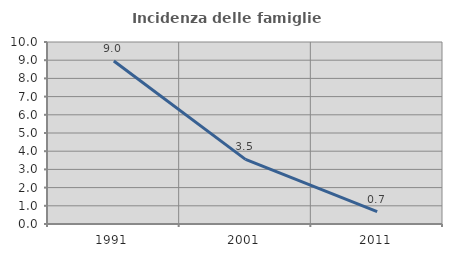
| Category | Incidenza delle famiglie numerose |
|---|---|
| 1991.0 | 8.955 |
| 2001.0 | 3.548 |
| 2011.0 | 0.676 |